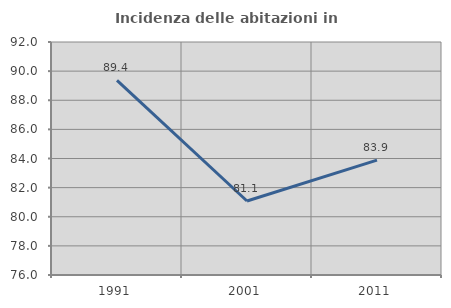
| Category | Incidenza delle abitazioni in proprietà  |
|---|---|
| 1991.0 | 89.362 |
| 2001.0 | 81.081 |
| 2011.0 | 83.886 |